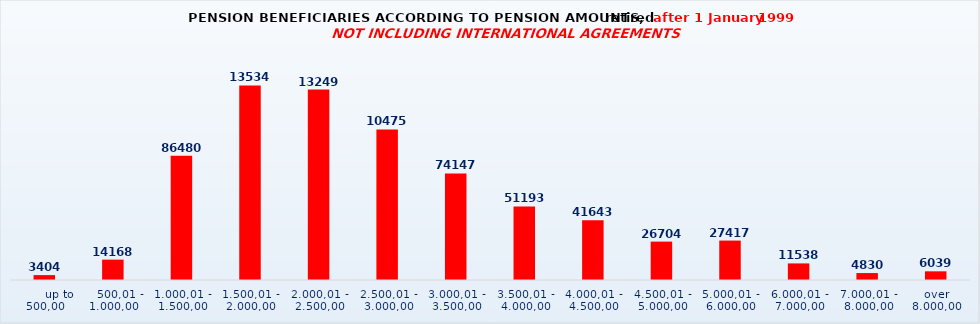
| Category | Series 0 |
|---|---|
|       up to 500,00 | 3404 |
|    500,01 - 1.000,00 | 14168 |
| 1.000,01 - 1.500,00 | 86480 |
| 1.500,01 - 2.000,00 | 135343 |
| 2.000,01 - 2.500,00 | 132491 |
| 2.500,01 - 3.000,00 | 104759 |
| 3.000,01 - 3.500,00 | 74147 |
| 3.500,01 - 4.000,00 | 51193 |
| 4.000,01 - 4.500,00 | 41643 |
| 4.500,01 - 5.000,00 | 26704 |
| 5.000,01 - 6.000,00 | 27417 |
| 6.000,01 - 7.000,00 | 11538 |
| 7.000,01 - 8.000,00 | 4830 |
| over 8.000,00 | 6039 |